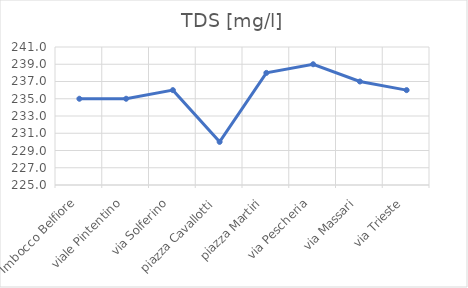
| Category | TDS [mg/l] |
|---|---|
| Imbocco Belfiore | 235 |
| viale Pintentino | 235 |
| via Solferino | 236 |
| piazza Cavallotti | 230 |
| piazza Martiri | 238 |
| via Pescheria | 239 |
| via Massari | 237 |
| via Trieste | 236 |